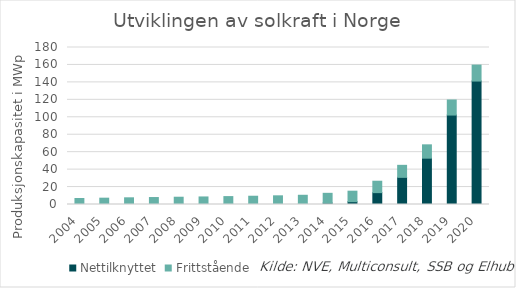
| Category | Nettilknyttet | Frittstående |
|---|---|---|
| 2004.0 | 0.075 | 6.815 |
| 2005.0 | 0.075 | 7.177 |
| 2006.0 | 0.128 | 7.54 |
| 2007.0 | 0.132 | 7.86 |
| 2008.0 | 0.132 | 8.21 |
| 2009.0 | 0.132 | 8.53 |
| 2010.0 | 0.192 | 8.87 |
| 2011.0 | 0.192 | 9.29 |
| 2012.0 | 0.192 | 9.76 |
| 2013.0 | 0.292 | 10.28 |
| 2014.0 | 1.712 | 11.099 |
| 2015.0 | 3.237 | 12.024 |
| 2016.0 | 13.613 | 13.074 |
| 2017.0 | 31.113 | 13.792 |
| 2018.0 | 53.113 | 15.292 |
| 2019.0 | 102.534 | 17.292 |
| 2020.0 | 141.534 | 18.292 |